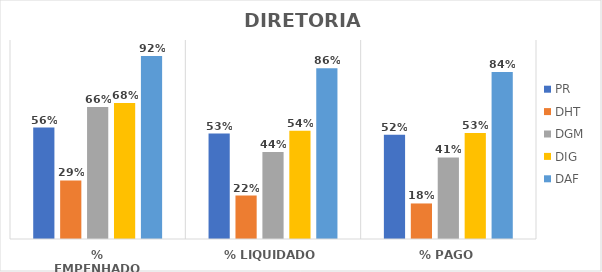
| Category | PR | DHT | DGM | DIG | DAF |
|---|---|---|---|---|---|
| % EMPENHADO | 0.56 | 0.294 | 0.663 | 0.684 | 0.92 |
| % LIQUIDADO | 0.53 | 0.219 | 0.437 | 0.544 | 0.858 |
| % PAGO | 0.523 | 0.179 | 0.41 | 0.532 | 0.84 |